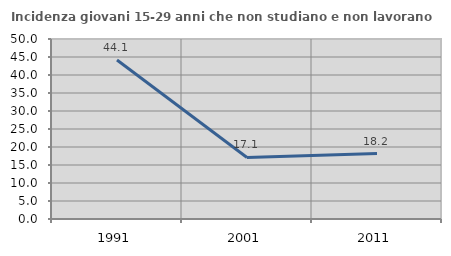
| Category | Incidenza giovani 15-29 anni che non studiano e non lavorano  |
|---|---|
| 1991.0 | 44.146 |
| 2001.0 | 17.094 |
| 2011.0 | 18.182 |